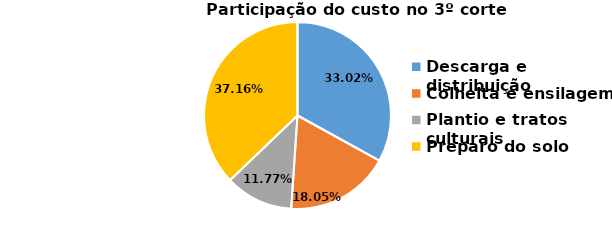
| Category | Partc. Custo |
|---|---|
| Descarga e distribuição | 0.33 |
| Colheita e ensilagem | 0.181 |
| Plantio e tratos culturais | 0.118 |
| Preparo do solo | 0.372 |